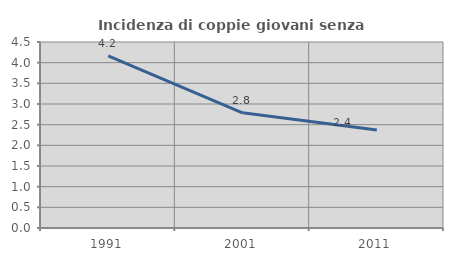
| Category | Incidenza di coppie giovani senza figli |
|---|---|
| 1991.0 | 4.167 |
| 2001.0 | 2.787 |
| 2011.0 | 2.372 |